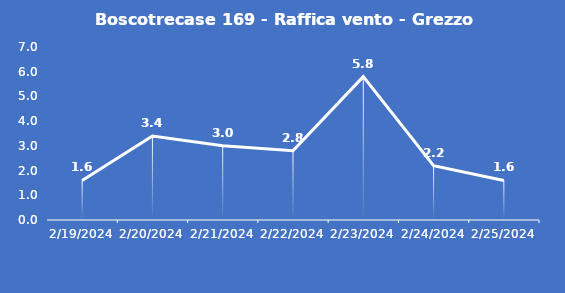
| Category | Boscotrecase 169 - Raffica vento - Grezzo (m/s) |
|---|---|
| 2/19/24 | 1.6 |
| 2/20/24 | 3.4 |
| 2/21/24 | 3 |
| 2/22/24 | 2.8 |
| 2/23/24 | 5.8 |
| 2/24/24 | 2.2 |
| 2/25/24 | 1.6 |